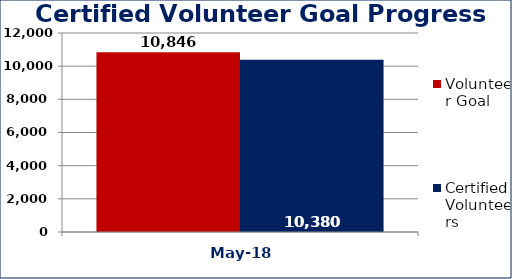
| Category | Volunteer Goal  | Certified Volunteers  |
|---|---|---|
| May-18 | 10846 | 10380 |